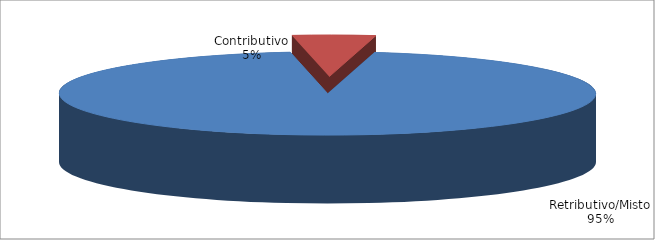
| Category | Series 1 |
|---|---|
| Retributivo/Misto | 255406 |
| Contributivo | 13429 |